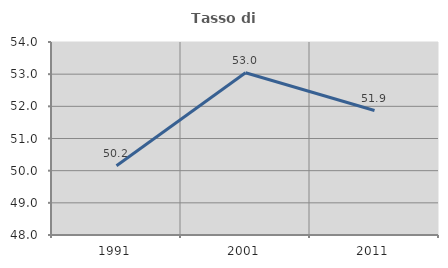
| Category | Tasso di occupazione   |
|---|---|
| 1991.0 | 50.151 |
| 2001.0 | 53.042 |
| 2011.0 | 51.868 |